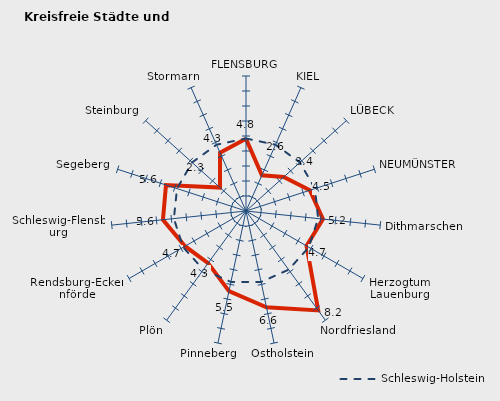
| Category | Kreise | Schleswig-Holstein |
|---|---|---|
| FLENSBURG | 4.813 | 4.835 |
| KIEL | 2.609 | 4.835 |
| LÜBECK | 3.381 | 4.835 |
| NEUMÜNSTER | 4.477 | 4.835 |
| Dithmarschen | 5.158 | 4.835 |
| Herzogtum Lauenburg | 4.661 | 4.835 |
| Nordfriesland | 8.189 | 4.835 |
| Ostholstein | 6.562 | 4.835 |
| Pinneberg | 5.46 | 4.835 |
| Plön | 4.297 | 4.835 |
| Rendsburg-Eckernförde | 4.695 | 4.835 |
| Schleswig-Flensburg | 5.568 | 4.835 |
| Segeberg | 5.61 | 4.835 |
| Steinburg | 2.336 | 4.835 |
| Stormarn | 4.255 | 4.835 |